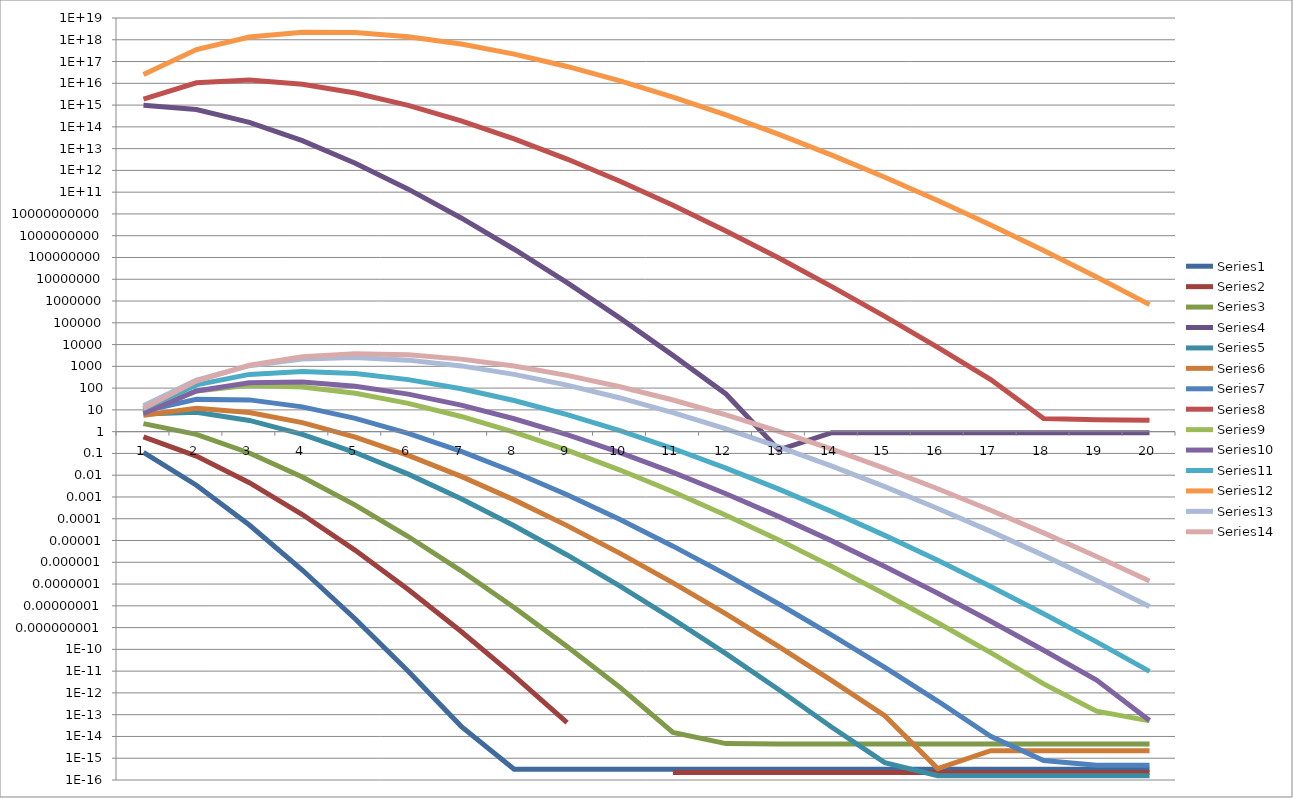
| Category | Series 0 | Series 1 | Series 2 | Series 3 | Series 4 | Series 5 | Series 6 | Series 7 | Series 8 | Series 9 | Series 10 | Series 11 | Series 12 | Series 13 |
|---|---|---|---|---|---|---|---|---|---|---|---|---|---|---|
| 0 | 0.111 | 0.571 | 2.332 | 972286350993506 | 6.554 | 5.712 | 8.775 | 1899572429022450 | 8.996 | 6.854 | 11.218 | 25642546754255300 | 15.439 | 11.996 |
| 1 | 0.003 | 0.075 | 0.751 | 627060590487265 | 7.72 | 11.729 | 30.393 | 10599113174756200 | 74.249 | 73.892 | 140.771 | 353980141697151040 | 235.439 | 209.57 |
| 2 | 0 | 0.005 | 0.105 | 162185490138105.97 | 3.286 | 7.637 | 28.801 | 14072303313821000 | 133.719 | 175.148 | 426.443 | 1332046448814870016 | 1072.236 | 1129.824 |
| 3 | 0 | 0 | 0.008 | 23279904882910.6 | 0.755 | 2.602 | 13.798 | 9117898663014260 | 113.688 | 190.614 | 581.562 | 2233756863628940032 | 2173.529 | 2725.802 |
| 4 | 0 | 0 | 0 | 2143290658050.56 | 0.11 | 0.556 | 4.085 | 3597552419914880 | 58.001 | 122.748 | 463.387 | 2165376644610360064 | 2525.965 | 3748.579 |
| 5 | 0 | 0 | 0 | 137771911047.85 | 0.011 | 0.082 | 0.829 | 965955651718348 | 19.984 | 52.977 | 245.647 | 1386981236344950016 | 1927.775 | 3367.51 |
| 6 | 0 | 0 | 0 | 6543378510.7 | 0.001 | 0.009 | 0.123 | 188916639261092 | 4.993 | 16.507 | 93.593 | 635732243046646016 | 1048.456 | 2147.58 |
| 7 | 0 | 0 | 0 | 239168236.783 | 0 | 0.001 | 0.014 | 28190649229323.8 | 0.949 | 3.903 | 26.981 | 219841265168187008 | 428.997 | 1027.606 |
| 8 | 0 | 0 | 0 | 6938576.561 | 0 | 0 | 0.001 | 3320572094111.29 | 0.142 | 0.726 | 6.106 | 59561486887670800 | 137.257 | 383.748 |
| 9 | 0 | 0 | 0 | 163695.042 | 0 | 0 | 0 | 316893270303.63 | 0.017 | 0.109 | 1.115 | 13006792885144200 | 35.348 | 115.189 |
| 10 | 0 | 0 | 0 | 3201.651 | 0 | 0 | 0 | 25014769405.319 | 0.002 | 0.014 | 0.168 | 2340783116825630 | 7.494 | 28.437 |
| 11 | 0 | 0 | 0 | 53.693 | 0 | 0 | 0 | 1661096946.296 | 0 | 0.001 | 0.021 | 353427422494236.06 | 1.332 | 5.881 |
| 12 | 0 | 0 | 0 | 0.145 | 0 | 0 | 0 | 94104706.683 | 0 | 0 | 0.002 | 45434460450754.4 | 0.201 | 1.034 |
| 13 | 0 | 0 | 0 | 0.898 | 0 | 0 | 0 | 4602677.699 | 0 | 0 | 0 | 5034885643356.74 | 0.026 | 0.157 |
| 14 | 0 | 0 | 0 | 0.889 | 0 | 0 | 0 | 196351.046 | 0 | 0 | 0 | 486065493311.815 | 0.003 | 0.021 |
| 15 | 0 | 0 | 0 | 0.889 | 0 | 0 | 0 | 7367.299 | 0 | 0 | 0 | 41253251559.12 | 0 | 0.002 |
| 16 | 0 | 0 | 0 | 0.889 | 0 | 0 | 0 | 248.684 | 0 | 0 | 0 | 3102663825.725 | 0 | 0 |
| 17 | 0 | 0 | 0 | 0.889 | 0 | 0 | 0 | 3.977 | 0 | 0 | 0 | 208242089.628 | 0 | 0 |
| 18 | 0 | 0 | 0 | 0.889 | 0 | 0 | 0 | 3.511 | 0 | 0 | 0 | 12550691.411 | 0 | 0 |
| 19 | 0 | 0 | 0 | 0.889 | 0 | 0 | 0 | 3.312 | 0 | 0 | 0 | 682936.545 | 0 | 0 |